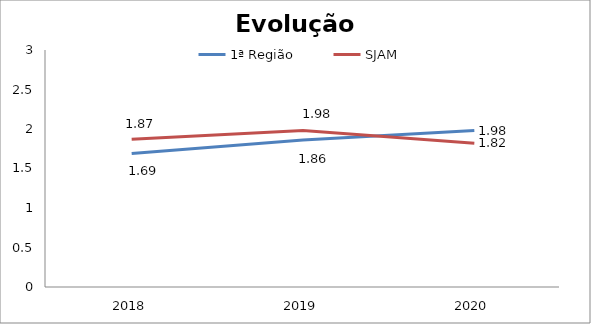
| Category | 1ª Região | SJAM |
|---|---|---|
| 0 | 1.69 | 1.87 |
| 1 | 1.86 | 1.98 |
| 2 | 1.98 | 1.82 |